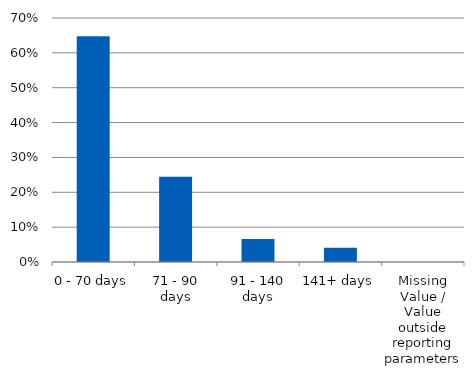
| Category | Total |
|---|---|
| 0 - 70 days | 0.648 |
| 71 - 90 days | 0.245 |
| 91 - 140 days | 0.066 |
| 141+ days | 0.041 |
| Missing Value / Value outside reporting parameters | 0 |